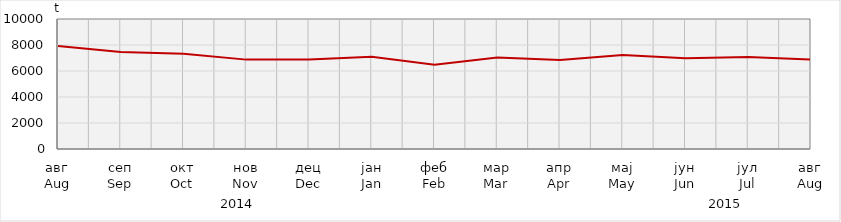
| Category | Series 0 |
|---|---|
| авг
Aug | 7925.8 |
| сеп
Sep | 7457.865 |
| окт
Oct | 7318.004 |
| нов
Nov | 6875.135 |
| дец
Dec | 6887.315 |
| јан
Jan | 7099.8 |
| феб
Feb | 6490.829 |
| мар
Mar | 7044.938 |
| апр
Apr | 6847.171 |
| мај
May | 7231.754 |
| јун
Jun | 6987.984 |
| јул
Jul | 7075.246 |
| авг
Aug | 6880.441 |